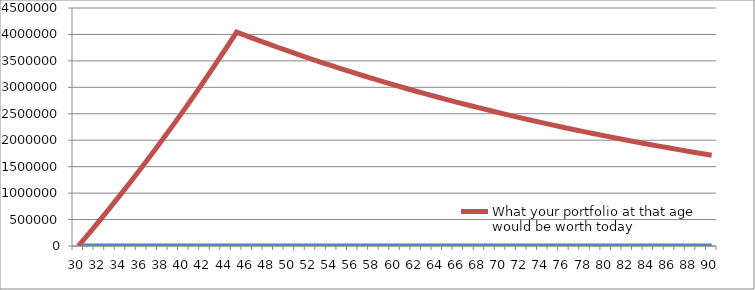
| Category | Age | What your portfolio at that age would be worth today |
|---|---|---|
| 30.0 | 30 | 0 |
| 31.0 | 31 | 235849.057 |
| 32.0 | 32 | 476148.095 |
| 33.0 | 33 | 720981.078 |
| 34.0 | 34 | 970433.552 |
| 35.0 | 35 | 1224592.675 |
| 36.0 | 36 | 1483547.254 |
| 37.0 | 37 | 1747387.768 |
| 38.0 | 38 | 2016206.405 |
| 39.0 | 39 | 2290097.092 |
| 40.0 | 40 | 2569155.528 |
| 41.0 | 41 | 2853479.217 |
| 42.0 | 42 | 3143167.504 |
| 43.0 | 43 | 3438321.608 |
| 44.0 | 44 | 3739044.657 |
| 45.0 | 45 | 4045441.726 |
| 46.0 | 46 | 3969112.637 |
| 47.0 | 47 | 3894223.719 |
| 48.0 | 48 | 3820747.8 |
| 49.0 | 49 | 3748658.219 |
| 50.0 | 50 | 3677928.819 |
| 51.0 | 51 | 3608533.935 |
| 52.0 | 52 | 3540448.389 |
| 53.0 | 53 | 3473647.476 |
| 54.0 | 54 | 3408106.958 |
| 55.0 | 55 | 3343803.053 |
| 56.0 | 56 | 3280712.429 |
| 57.0 | 57 | 3218812.195 |
| 58.0 | 58 | 3158079.889 |
| 59.0 | 59 | 3098493.476 |
| 60.0 | 60 | 3040031.335 |
| 61.0 | 61 | 2982672.253 |
| 62.0 | 62 | 2926395.418 |
| 63.0 | 63 | 2871180.411 |
| 64.0 | 64 | 2817007.195 |
| 65.0 | 65 | 2763856.116 |
| 66.0 | 66 | 2711707.888 |
| 67.0 | 67 | 2660543.588 |
| 68.0 | 68 | 2610344.652 |
| 69.0 | 69 | 2561092.866 |
| 70.0 | 70 | 2512770.359 |
| 71.0 | 71 | 2465359.598 |
| 72.0 | 72 | 2418843.379 |
| 73.0 | 73 | 2373204.825 |
| 74.0 | 74 | 2328427.375 |
| 75.0 | 75 | 2284494.783 |
| 76.0 | 76 | 2241391.108 |
| 77.0 | 77 | 2199100.71 |
| 78.0 | 78 | 2157608.244 |
| 79.0 | 79 | 2116898.654 |
| 80.0 | 80 | 2076957.17 |
| 81.0 | 81 | 2037769.299 |
| 82.0 | 82 | 1999320.822 |
| 83.0 | 83 | 1961597.787 |
| 84.0 | 84 | 1924586.508 |
| 85.0 | 85 | 1888273.555 |
| 86.0 | 86 | 1852645.752 |
| 87.0 | 87 | 1817690.172 |
| 88.0 | 88 | 1783394.131 |
| 89.0 | 89 | 1749745.185 |
| 90.0 | 90 | 1716731.125 |